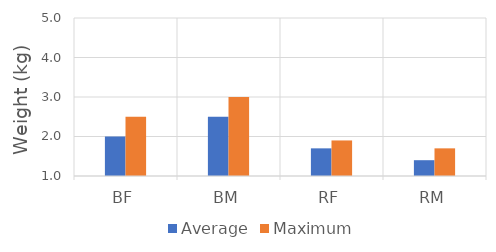
| Category | Average | Maximum |
|---|---|---|
| BF | 2 | 2.5 |
| BM | 2.5 | 3 |
| RF | 1.7 | 1.9 |
| RM | 1.4 | 1.7 |